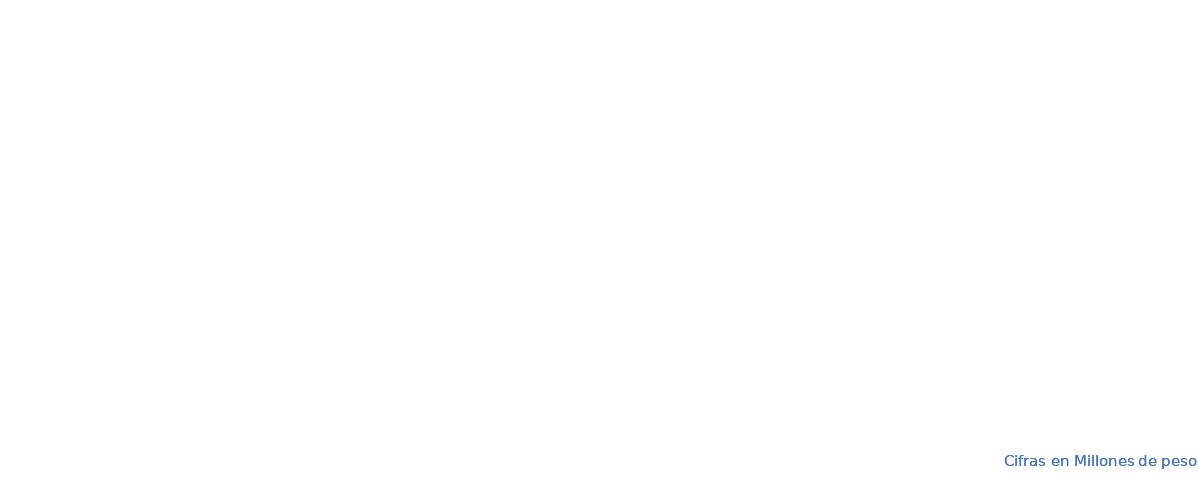
| Category | APROPIACION | COMPROMISOS |  OBLIGACIONES |  PAGOS |
|---|---|---|---|---|
| A-FUNCIONAMIENTO | 99785.985 | 71364.142 | 69141.968 | 67642.043 |
| B-SERVICIO DE LA DEUDA PÚBLICA | 1167604.335 | 932302.884 | 932302.884 | 932302.884 |
| C- INVERSION | 4505182.025 | 4351551.929 | 380406.501 | 380087.081 |